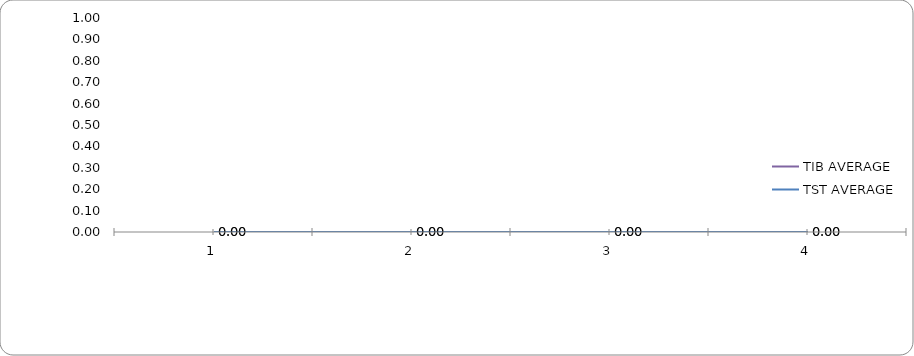
| Category | TIB AVERAGE | TST AVERAGE |
|---|---|---|
| 0 | 0 | 0 |
| 1 | 0 | 0 |
| 2 | 0 | 0 |
| 3 | 0 | 0 |